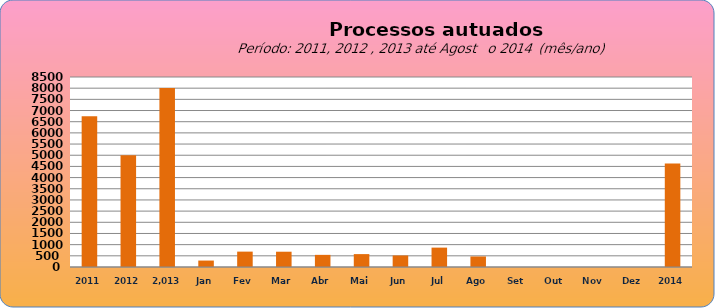
| Category | 6749 4998  8.003   288  688 684 543 577 516 867 471 0 0 0 0 |
|---|---|
| 2011 | 6749 |
| 2012 | 4998 |
|  2.013  | 8003 |
| Jan | 288 |
| Fev | 688 |
| Mar | 684 |
| Abr | 543 |
| Mai | 577 |
| Jun | 516 |
| Jul | 867 |
| Ago | 471 |
| Set | 0 |
| Out | 0 |
| Nov | 0 |
| Dez | 0 |
| 2014 | 4627 |